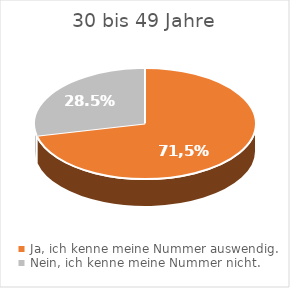
| Category | 30–49 Jahre |
|---|---|
| Ja, ich kenne meine Nummer auswendig. | 71.5 |
| Nein, ich kenne meine Nummer nicht.  | 28.5 |